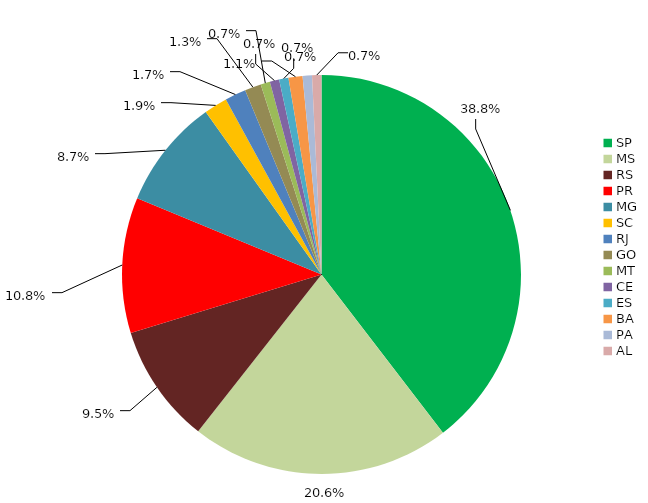
| Category | Series 0 | Series 1 |
|---|---|---|
| SP | 0.388 | 0.395 |
| MS | 0.206 | 0.2 |
| RS | 0.095 | 0.098 |
| PR | 0.108 | 0.102 |
| MG | 0.087 | 0.089 |
| SC | 0.019 | 0.017 |
| RJ | 0.017 | 0.013 |
| GO | 0.013 | 0.019 |
| MT | 0.007 | 0.008 |
| CE | 0.007 | 0.008 |
| ES | 0.007 | 0.009 |
| BA | 0.011 | 0.008 |
| PA | 0.007 | 0.008 |
| AL | 0.007 | 0.004 |